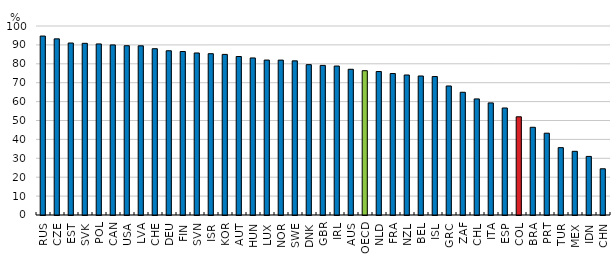
| Category | % |
|---|---|
| RUS | 94.679 |
| CZE | 93.19 |
| EST | 91 |
| SVK | 90.839 |
| POL | 90.517 |
| CAN | 89.989 |
| USA | 89.57 |
| LVA | 89.515 |
| CHE | 87.985 |
| DEU | 86.903 |
| FIN | 86.507 |
| SVN | 85.725 |
| ISR | 85.355 |
| KOR | 84.978 |
| AUT | 83.856 |
| HUN | 83.094 |
| LUX | 81.977 |
| NOR | 81.947 |
| SWE | 81.555 |
| DNK | 79.554 |
| GBR | 79.165 |
| IRL | 78.813 |
| AUS | 77.104 |
| OECD | 76.348 |
| NLD | 75.901 |
| FRA | 74.846 |
| NZL | 74.075 |
| BEL | 73.551 |
| ISL | 73.257 |
| GRC | 68.266 |
| ZAF | 64.934 |
| CHL | 61.414 |
| ITA | 59.307 |
| ESP | 56.618 |
| COL | 51.967 |
| BRA | 46.411 |
| PRT | 43.28 |
| TUR | 35.633 |
| MEX | 33.697 |
| IDN | 31 |
| CHN | 24.459 |